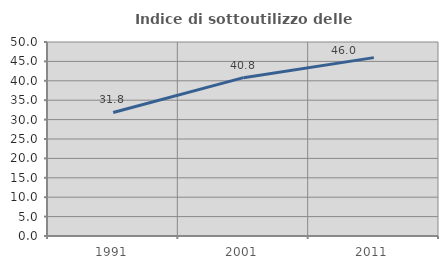
| Category | Indice di sottoutilizzo delle abitazioni  |
|---|---|
| 1991.0 | 31.83 |
| 2001.0 | 40.811 |
| 2011.0 | 45.974 |